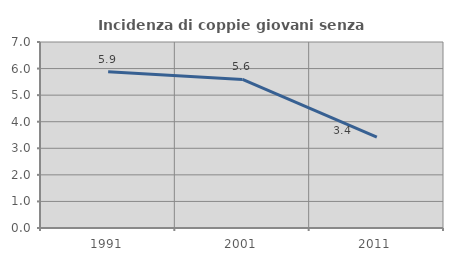
| Category | Incidenza di coppie giovani senza figli |
|---|---|
| 1991.0 | 5.882 |
| 2001.0 | 5.59 |
| 2011.0 | 3.418 |